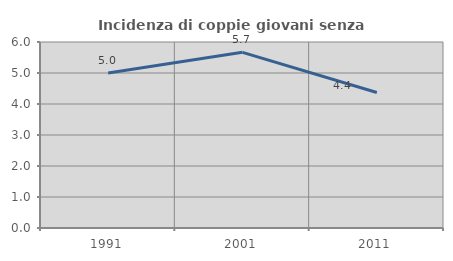
| Category | Incidenza di coppie giovani senza figli |
|---|---|
| 1991.0 | 5 |
| 2001.0 | 5.666 |
| 2011.0 | 4.371 |